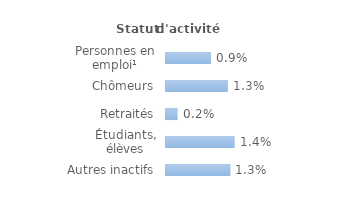
| Category | Series 0 |
|---|---|
| Personnes en emploi¹ | 0.009 |
| Chômeurs | 0.013 |
| Retraités | 0.002 |
| Étudiants, élèves | 0.014 |
| Autres inactifs  | 0.013 |